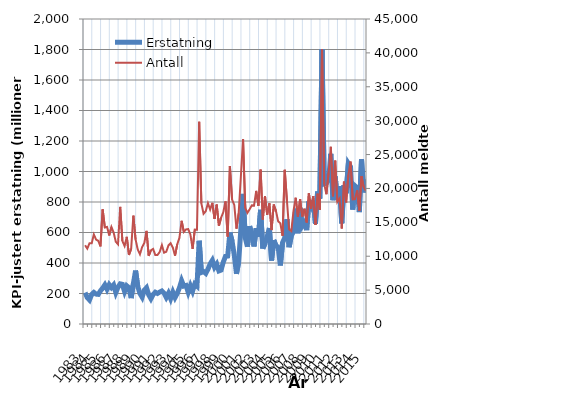
| Category | Erstatning |
|---|---|
| 1983.0 | 205.859 |
| nan | 172.439 |
| nan | 157.695 |
| nan | 193.17 |
| 1984.0 | 207.142 |
| nan | 195.941 |
| nan | 194.272 |
| nan | 217.294 |
| 1985.0 | 234.815 |
| nan | 256.66 |
| nan | 227.431 |
| nan | 257.937 |
| 1986.0 | 239.147 |
| nan | 255.898 |
| nan | 205.963 |
| nan | 241.024 |
| 1987.0 | 263.314 |
| nan | 259.842 |
| nan | 212.64 |
| nan | 250.177 |
| 1988.0 | 238.119 |
| nan | 169.742 |
| nan | 264.377 |
| nan | 350.226 |
| 1989.0 | 247.426 |
| nan | 199.98 |
| nan | 175.966 |
| nan | 222 |
| 1990.0 | 237.704 |
| nan | 191.233 |
| nan | 165.85 |
| nan | 193.043 |
| 1991.0 | 208.312 |
| nan | 200.291 |
| nan | 209.618 |
| nan | 216.719 |
| 1992.0 | 202.456 |
| nan | 174.447 |
| nan | 201.569 |
| nan | 166.334 |
| 1993.0 | 208.704 |
| nan | 173.688 |
| nan | 200.666 |
| nan | 237.394 |
| 1994.0 | 284.331 |
| nan | 248.57 |
| nan | 252.544 |
| nan | 208.159 |
| 1995.0 | 250.788 |
| nan | 215.752 |
| nan | 262.161 |
| nan | 248.909 |
| 1996.0 | 545.856 |
| nan | 338.003 |
| nan | 344.042 |
| nan | 331.801 |
| 1997.0 | 359.204 |
| nan | 394.166 |
| nan | 417.426 |
| nan | 372.44 |
| 1998.0 | 392.915 |
| nan | 348.086 |
| nan | 353.773 |
| nan | 406.622 |
| 1999.0 | 443.507 |
| nan | 445.662 |
| nan | 599.695 |
| nan | 543.103 |
| 2000.0 | 452.712 |
| nan | 328.768 |
| nan | 407.58 |
| nan | 621.434 |
| 2001.0 | 852.847 |
| nan | 564.588 |
| nan | 507.075 |
| nan | 641.553 |
| 2002.0 | 584.299 |
| nan | 508.397 |
| nan | 628.291 |
| nan | 572.513 |
| 2003.0 | 748.769 |
| nan | 495.059 |
| nan | 526.68 |
| nan | 573.74 |
| 2004.0 | 629.424 |
| nan | 416.133 |
| nan | 550.144 |
| nan | 514.216 |
| 2005.0 | 503.291 |
| nan | 384.081 |
| nan | 533.208 |
| nan | 565.067 |
| 2006.0 | 686.848 |
| nan | 503.708 |
| nan | 579.578 |
| nan | 604.661 |
| 2007.0 | 756.853 |
| nan | 595.046 |
| nan | 760.271 |
| nan | 642.795 |
| 2008.0 | 664.734 |
| nan | 615.377 |
| nan | 803.718 |
| nan | 771.888 |
| 2009.0 | 810.01 |
| nan | 657.599 |
| nan | 868.671 |
| nan | 821.076 |
| 2010.0 | 1801.107 |
| nan | 918.654 |
| nan | 923.074 |
| nan | 944.344 |
| 2011.0 | 1116.041 |
| nan | 811.559 |
| nan | 967.659 |
| nan | 815.509 |
| 2012.0 | 903.472 |
| nan | 660.521 |
| nan | 910.673 |
| nan | 857.485 |
| 2013.0 | 1053.081 |
| nan | 1031.165 |
| nan | 750.323 |
| nan | 906.303 |
| 2014.0 | 893.859 |
| nan | 734.034 |
| nan | 1079.804 |
| nan | 863.368 |
| 2015.0 | 947.227 |